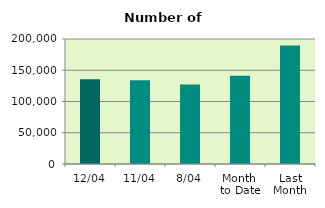
| Category | Series 0 |
|---|---|
| 12/04 | 135728 |
| 11/04 | 133890 |
| 8/04 | 127308 |
| Month 
to Date | 141202.75 |
| Last
Month | 189416.87 |